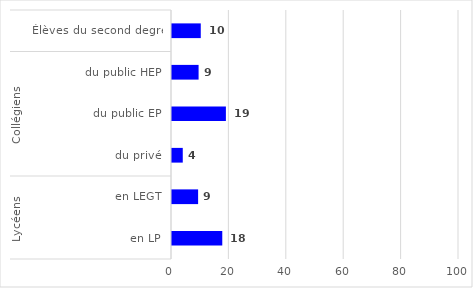
| Category | Series 0 |
|---|---|
| 0 | 10.024 |
| 1 | 9.265 |
| 2 | 18.779 |
| 3 | 3.751 |
| 4 | 9.098 |
| 5 | 17.518 |